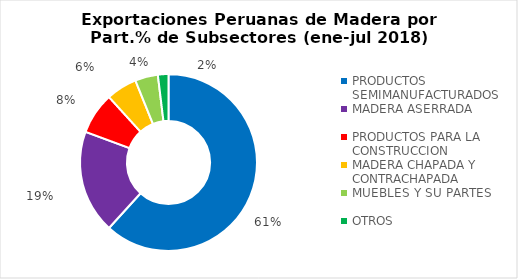
| Category | Part.% 2018 |
|---|---|
| PRODUCTOS SEMIMANUFACTURADOS | 0.61 |
| MADERA ASERRADA | 0.187 |
| PRODUCTOS PARA LA CONSTRUCCION | 0.075 |
| MADERA CHAPADA Y CONTRACHAPADA | 0.056 |
| MUEBLES Y SU PARTES | 0.041 |
| OTROS | 0.019 |